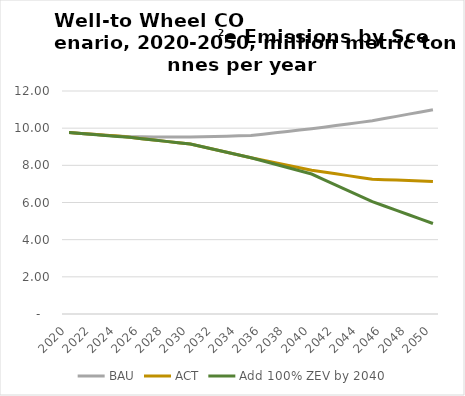
| Category | BAU | ACT | Add 100% ZEV by 2040 |
|---|---|---|---|
| 2020.0 | 9.761 | 9.761 | 9.761 |
| 2021.0 | 9.716 | 9.716 | 9.71 |
| 2022.0 | 9.67 | 9.67 | 9.659 |
| 2023.0 | 9.625 | 9.625 | 9.607 |
| 2024.0 | 9.579 | 9.579 | 9.556 |
| 2025.0 | 9.534 | 9.505 | 9.505 |
| 2026.0 | 9.532 | 9.433 | 9.433 |
| 2027.0 | 9.53 | 9.361 | 9.361 |
| 2028.0 | 9.527 | 9.289 | 9.289 |
| 2029.0 | 9.525 | 9.217 | 9.217 |
| 2030.0 | 9.523 | 9.145 | 9.145 |
| 2031.0 | 9.539 | 8.997 | 8.997 |
| 2032.0 | 9.554 | 8.849 | 8.849 |
| 2033.0 | 9.57 | 8.7 | 8.7 |
| 2034.0 | 9.586 | 8.552 | 8.552 |
| 2035.0 | 9.601 | 8.404 | 8.404 |
| 2036.0 | 9.675 | 8.27 | 8.229 |
| 2037.0 | 9.749 | 8.135 | 8.055 |
| 2038.0 | 9.822 | 8.001 | 7.88 |
| 2039.0 | 9.896 | 7.867 | 7.706 |
| 2040.0 | 9.97 | 7.732 | 7.531 |
| 2041.0 | 10.055 | 7.637 | 7.234 |
| 2042.0 | 10.141 | 7.541 | 6.937 |
| 2043.0 | 10.226 | 7.446 | 6.64 |
| 2044.0 | 10.311 | 7.35 | 6.343 |
| 2045.0 | 10.397 | 7.255 | 6.046 |
| 2046.0 | 10.516 | 7.23 | 5.811 |
| 2047.0 | 10.635 | 7.205 | 5.576 |
| 2048.0 | 10.755 | 7.18 | 5.341 |
| 2049.0 | 10.874 | 7.155 | 5.106 |
| 2050.0 | 10.993 | 7.131 | 4.872 |